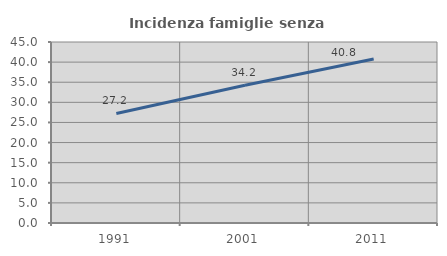
| Category | Incidenza famiglie senza nuclei |
|---|---|
| 1991.0 | 27.244 |
| 2001.0 | 34.234 |
| 2011.0 | 40.758 |